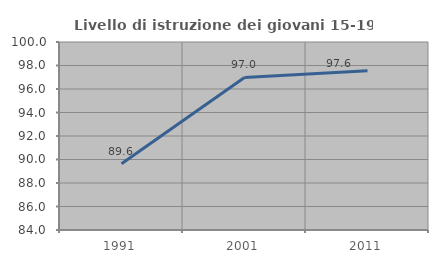
| Category | Livello di istruzione dei giovani 15-19 anni |
|---|---|
| 1991.0 | 89.632 |
| 2001.0 | 96.983 |
| 2011.0 | 97.561 |